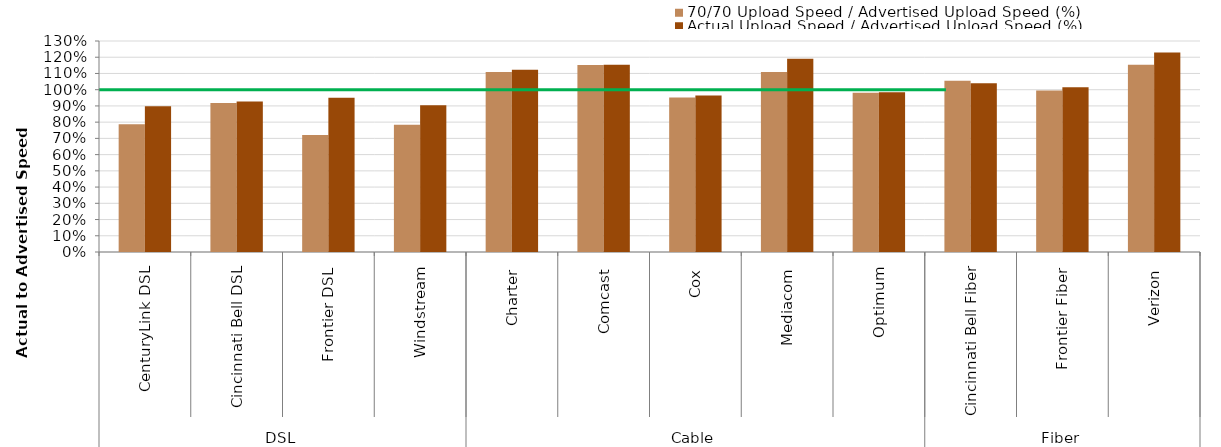
| Category | 70/70 Upload Speed / Advertised Upload Speed (%) | Actual Upload Speed / Advertised Upload Speed (%) |
|---|---|---|
| 0 | 0.788 | 0.899 |
| 1 | 0.919 | 0.927 |
| 2 | 0.721 | 0.95 |
| 3 | 0.784 | 0.904 |
| 4 | 1.11 | 1.122 |
| 5 | 1.153 | 1.153 |
| 6 | 0.952 | 0.965 |
| 7 | 1.11 | 1.191 |
| 8 | 0.981 | 0.985 |
| 9 | 1.055 | 1.04 |
| 10 | 0.995 | 1.014 |
| 11 | 1.154 | 1.228 |